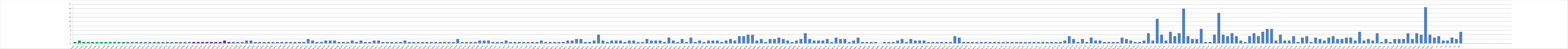
| Category | Series 0 |
|---|---|
| A.W1 | 1 |
| A.W2 | 2 |
| A.W3 | 1 |
| A.W4 | 1 |
| A.W5 | 1 |
| A.W6 | 1 |
| A.W7 | 1 |
| A.W8 | 1 |
| A.W9 | 1 |
| A.W10 | 1 |
| A.W11 | 1 |
| A.W12 | 1 |
| A.W13 | 1 |
| A.W14 | 1 |
| A.W15 | 1 |
| A.W16 | 1 |
| A.W17 | 1 |
| A.W18 | 1 |
| A.W19 | 1 |
| A.W20 | 1 |
| A.W21 | 1 |
| A.W22 | 1 |
| A.W23 | 1 |
| A.W24 | 1 |
| A.W25 | 1 |
| A.W26 | 1 |
| A.W27 | 1 |
| A.W28 | 1 |
| A.W29 | 1 |
| A.W30 | 1 |
| A.W31 | 1 |
| A.W32 | 1 |
| A.W33 | 1 |
| A.W34 | 1 |
| A.W35 | 2 |
| A.W36 | 1 |
| A.W37 | 1 |
| A.W38 | 1 |
| A.W39 | 1 |
| A.W40 | 2 |
| A.W41 | 2 |
| A.W42 | 1 |
| A.W43 | 1 |
| A.W44 | 1 |
| A.W45 | 1 |
| A.W46 | 1 |
| A.W47 | 1 |
| A.W48 | 1 |
| A.W49 | 1 |
| A.W50 | 1 |
| A.W51 | 1 |
| A.W52 | 1 |
| A.W53 | 1 |
| B.W1 | 3 |
| B.W2 | 2 |
| B.W3 | 1 |
| B.W4 | 1 |
| B.W5 | 2 |
| B.W6 | 2 |
| B.W7 | 2 |
| B.W8 | 1 |
| B.W9 | 1 |
| B.W10 | 1 |
| B.W11 | 2 |
| B.W12 | 1 |
| B.W13 | 2 |
| B.W14 | 1 |
| B.W15 | 1 |
| B.W16 | 2 |
| B.W17 | 2 |
| B.W18 | 1 |
| B.W19 | 1 |
| B.W20 | 1 |
| B.W21 | 1 |
| B.W22 | 1 |
| B.W23 | 2 |
| B.W24 | 1 |
| B.W25 | 1 |
| B.W26 | 1 |
| B.W27 | 1 |
| B.W28 | 1 |
| B.W29 | 1 |
| B.W30 | 1 |
| B.W31 | 1 |
| B.W32 | 1 |
| B.W33 | 1 |
| B.W34 | 1 |
| B.W35 | 3 |
| B.W36 | 1 |
| B.W37 | 1 |
| B.W38 | 1 |
| B.W39 | 1 |
| B.W40 | 2 |
| B.W41 | 2 |
| B.W42 | 2 |
| B.W43 | 1 |
| C.W1 | 1 |
| C.W2 | 1 |
| C.W3 | 2 |
| C.W4 | 1 |
| C.W5 | 1 |
| C.W6 | 1 |
| C.W7 | 1 |
| C.W8 | 1 |
| C.W9 | 1 |
| C.W10 | 1 |
| C.W11 | 2 |
| C.W12 | 1 |
| C.W13 | 1 |
| C.W14 | 1 |
| C.W15 | 1 |
| C.W16 | 1 |
| C.W17 | 2 |
| C.W18 | 2 |
| C.W19 | 3 |
| C.W20 | 3 |
| C.W21 | 1 |
| C.W22 | 1 |
| C.W23 | 2 |
| C.W24 | 6 |
| C.W25 | 2 |
| C.W26 | 1 |
| C.W27 | 2 |
| C.W28 | 2 |
| C.W29 | 2 |
| C.W30 | 1 |
| C.W31 | 2 |
| C.W32 | 2 |
| C.W33 | 1 |
| C.W34 | 1 |
| C.W35 | 3 |
| C.W36 | 2 |
| C.W37 | 2 |
| C.W38 | 2 |
| C.W39 | 1 |
| C.W40 | 4 |
| C.W41 | 2 |
| C.W42 | 1 |
| C.W43 | 3 |
| C.W44 | 1 |
| C.W45 | 4 |
| C.W46 | 1 |
| C.W47 | 2 |
| C.W48 | 1 |
| C.W49 | 2 |
| C.W50 | 2 |
| C.W51 | 2 |
| C.W52 | 1 |
| C.W53 | 2 |
| C.W54 | 3 |
| C.W55 | 2 |
| C.W56 | 5 |
| C.W57 | 5 |
| C.W58 | 6 |
| C.W59 | 6 |
| C.W60 | 2 |
| C.W61 | 3 |
| C.W62 | 1 |
| C.W63 | 3 |
| C.W64 | 3 |
| C.W65 | 4 |
| C.W66 | 3 |
| C.W67 | 2 |
| C.W68 | 1 |
| C.W69 | 2 |
| C.W70 | 3 |
| C.W71 | 7 |
| C.W72 | 3 |
| C.W73 | 2 |
| C.W74 | 2 |
| C.W75 | 2 |
| C.W76 | 3 |
| C.W77 | 1 |
| C.W78 | 4 |
| C.W79 | 3 |
| C.W80 | 3 |
| C.W81 | 1 |
| C.W82 | 2 |
| C.W83 | 4 |
| C.W84 | 1 |
| C.W85 | 1 |
| C.W86 | 1 |
| C.W87 | 1 |
| C.W88 | 0 |
| C.W89 | 1 |
| C.W90 | 1 |
| C.W91 | 1 |
| C.W92 | 2 |
| C.W93 | 3 |
| C.W94 | 1 |
| C.W95 | 3 |
| C.W96 | 2 |
| C.W97 | 2 |
| C.W98 | 2 |
| C.W99 | 1 |
| C.W100 | 1 |
| C.W101 | 1 |
| C.W102 | 1 |
| C.W103 | 1 |
| C.W104 | 1 |
| C.W105 | 5 |
| C.W106 | 4 |
| C.W107 | 1 |
| C.W108 | 1 |
| A.U1 | 1 |
| A.U2 | 1 |
| A.U3 | 1 |
| A.U4 | 1 |
| A.U5 | 1 |
| A.U6 | 1 |
| A.U7 | 1 |
| A.U8 | 1 |
| A.U9 | 1 |
| A.U10 | 1 |
| A.U11 | 1 |
| A.U12 | 1 |
| A.U13 | 1 |
| A.U14 | 1 |
| A.U15 | 1 |
| A.U16 | 1 |
| A.U17 | 1 |
| A.U18 | 1 |
| A.U19 | 1 |
| B.U1 | 1 |
| B.U2 | 1 |
| B.U3 | 2 |
| B.U4 | 5 |
| B.U5 | 3 |
| B.U6 | 1 |
| B.U7 | 3 |
| B.U8 | 1 |
| B.U9 | 4 |
| B.U10 | 2 |
| B.U11 | 2 |
| B.U12 | 1 |
| B.U13 | 1 |
| B.U14 | 1 |
| B.U15 | 1 |
| B.U16 | 4 |
| B.U17 | 3 |
| B.U18 | 2 |
| B.U19 | 1 |
| B.U20 | 1 |
| C.U1 | 2 |
| C.U2 | 7 |
| C.U3 | 2 |
| C.U4 | 17 |
| C.U5 | 6 |
| C.U6 | 2 |
| C.U7 | 8 |
| C.U8 | 5 |
| C.U9 | 7 |
| C.U10 | 24 |
| C.U11 | 5 |
| C.U12 | 3 |
| C.U13 | 3 |
| C.U14 | 10 |
| C.U15 | 1 |
| C.U16 | 1 |
| C.U17 | 6 |
| C.U18 | 21 |
| C.U19 | 6 |
| C.U20 | 5 |
| C.U21 | 7 |
| C.U22 | 5 |
| C.U23 | 2 |
| C.U24 | 1 |
| C.U25 | 5 |
| C.U26 | 7 |
| C.U27 | 5 |
| C.U28 | 8 |
| C.U29 | 10 |
| C.U30 | 10 |
| C.U31 | 2 |
| C.U32 | 6 |
| C.U33 | 2 |
| C.U34 | 2 |
| C.U35 | 5 |
| C.U36 | 1 |
| C.U37 | 4 |
| C.U38 | 5 |
| C.U39 | 1 |
| C.U40 | 4 |
| C.U41 | 3 |
| C.U42 | 2 |
| C.U43 | 4 |
| C.U44 | 5 |
| C.U45 | 3 |
| C.U46 | 3 |
| C.U47 | 4 |
| C.U48 | 4 |
| C.U49 | 2 |
| C.U50 | 8 |
| C.U51 | 2 |
| C.U52 | 3 |
| C.U53 | 2 |
| C.U54 | 7 |
| C.U55 | 1 |
| C.U56 | 3 |
| C.U57 | 1 |
| C.U58 | 3 |
| C.U59 | 3 |
| C.U60 | 3 |
| C.U61 | 7 |
| C.U62 | 3 |
| C.U63 | 7 |
| C.U64 | 6 |
| C.U65 | 25 |
| C.U66 | 6 |
| C.U67 | 4 |
| K1 | 5 |
| K2 | 2 |
| K3 | 2 |
| K4 | 4 |
| K5 | 3 |
| K6 | 8 |